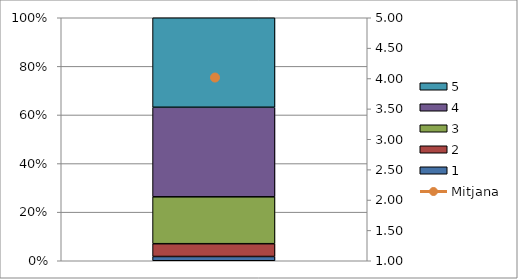
| Category | 1 | 2 | 3 | 4 | 5 |
|---|---|---|---|---|---|
| 0 | 1 | 3 | 11 | 21 | 21 |